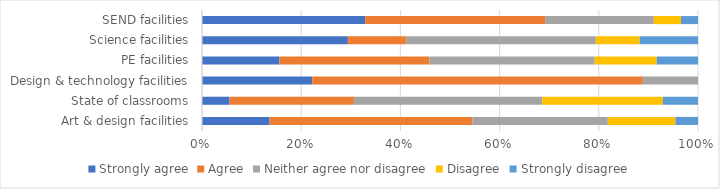
| Category | Strongly agree | Agree | Neither agree nor disagree | Disagree | Strongly disagree |
|---|---|---|---|---|---|
| Art & design facilities | 0.136 | 0.409 | 0.273 | 0.136 | 0.045 |
| State of classrooms | 0.056 | 0.251 | 0.38 | 0.243 | 0.071 |
| Design & technology facilities | 0.222 | 0.667 | 0.111 | 0 | 0 |
| PE facilities | 0.156 | 0.302 | 0.333 | 0.125 | 0.083 |
| Science facilities | 0.294 | 0.118 | 0.382 | 0.088 | 0.118 |
| SEND facilities | 0.329 | 0.363 | 0.219 | 0.055 | 0.034 |